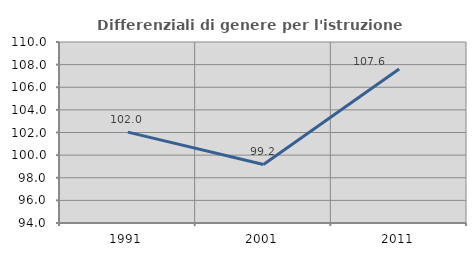
| Category | Differenziali di genere per l'istruzione superiore |
|---|---|
| 1991.0 | 102.032 |
| 2001.0 | 99.174 |
| 2011.0 | 107.615 |